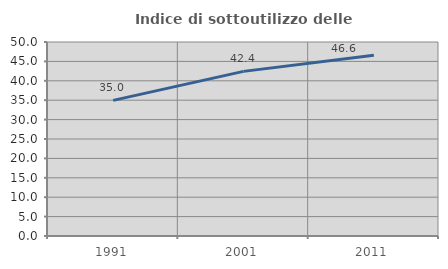
| Category | Indice di sottoutilizzo delle abitazioni  |
|---|---|
| 1991.0 | 34.961 |
| 2001.0 | 42.432 |
| 2011.0 | 46.561 |